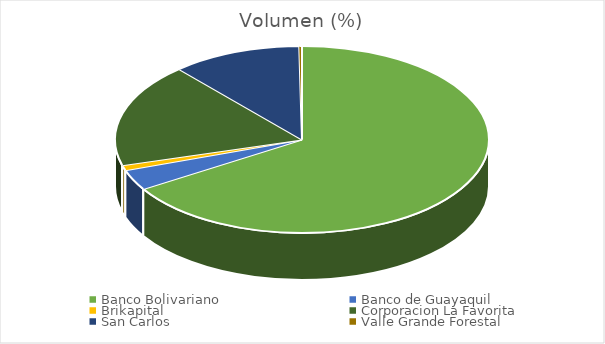
| Category | Volumen |
|---|---|
| Banco Bolivariano | 366000 |
| Banco de Guayaquil | 19620.15 |
| Brikapital | 5000 |
| Corporacion La Favorita | 99697.5 |
| San Carlos | 61872.55 |
| Valle Grande Forestal | 1300 |